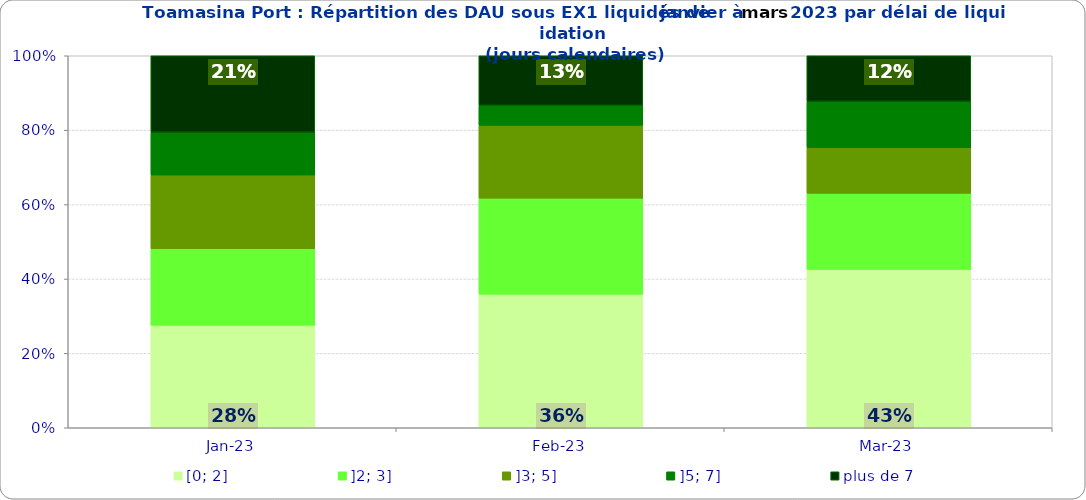
| Category | [0; 2] | ]2; 3] | ]3; 5] | ]5; 7] | plus de 7 |
|---|---|---|---|---|---|
| 2023-01-01 | 0.276 | 0.206 | 0.198 | 0.115 | 0.206 |
| 2023-02-01 | 0.359 | 0.258 | 0.196 | 0.054 | 0.133 |
| 2023-03-01 | 0.426 | 0.204 | 0.123 | 0.125 | 0.123 |